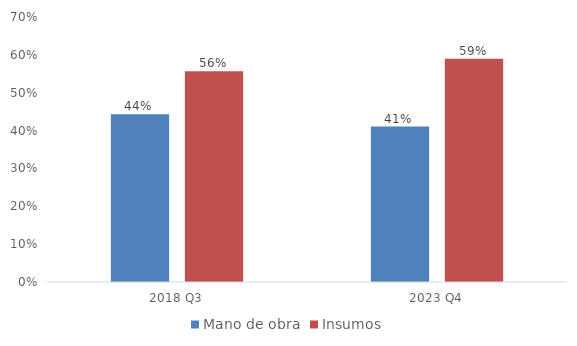
| Category | Mano de obra | Insumos |
|---|---|---|
| 2018 Q3 | 0.443 | 0.557 |
| 2023 Q4 | 0.411 | 0.589 |